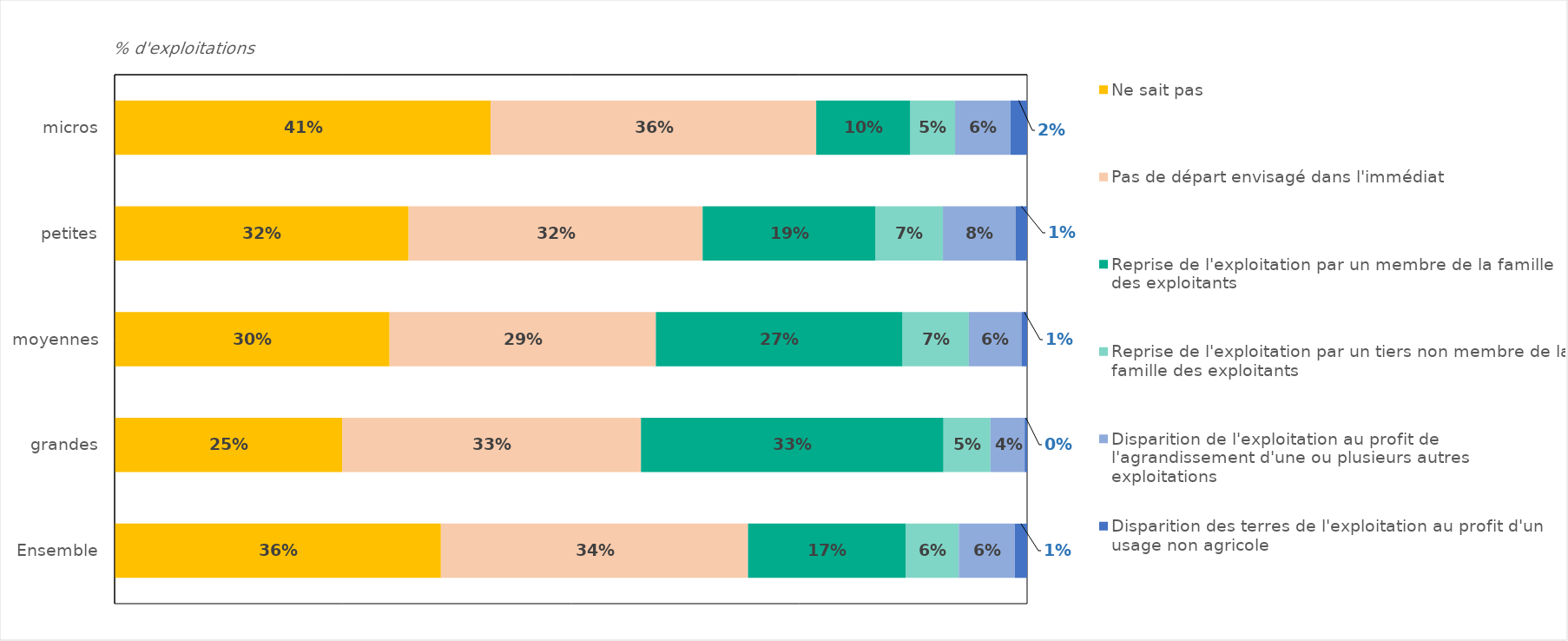
| Category | Ne sait pas  | Pas de départ envisagé dans l'immédiat | Reprise de l'exploitation par un membre de la famille des exploitants | Reprise de l'exploitation par un tiers non membre de la famille des exploitants | Disparition de l'exploitation au profit de l'agrandissement d'une ou plusieurs autres exploitations | Disparition des terres de l'exploitation au profit d'un usage non agricole |
|---|---|---|---|---|---|---|
| micros | 0.412 | 0.357 | 0.103 | 0.049 | 0.061 | 0.018 |
| petites | 0.322 | 0.322 | 0.189 | 0.074 | 0.08 | 0.013 |
| moyennes | 0.301 | 0.292 | 0.27 | 0.073 | 0.058 | 0.006 |
| grandes | 0.249 | 0.327 | 0.331 | 0.052 | 0.037 | 0.003 |
| Ensemble | 0.358 | 0.337 | 0.173 | 0.058 | 0.061 | 0.013 |